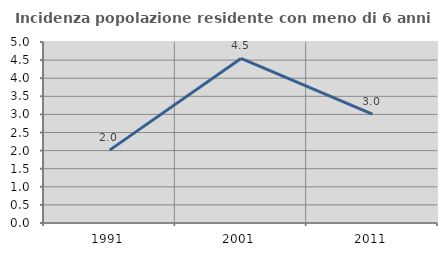
| Category | Incidenza popolazione residente con meno di 6 anni |
|---|---|
| 1991.0 | 2.013 |
| 2001.0 | 4.545 |
| 2011.0 | 3.008 |